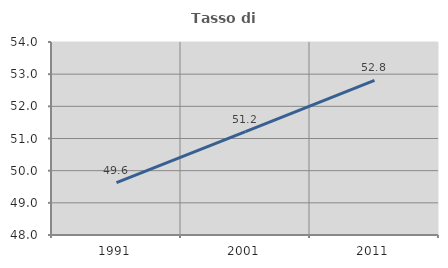
| Category | Tasso di occupazione   |
|---|---|
| 1991.0 | 49.63 |
| 2001.0 | 51.215 |
| 2011.0 | 52.806 |